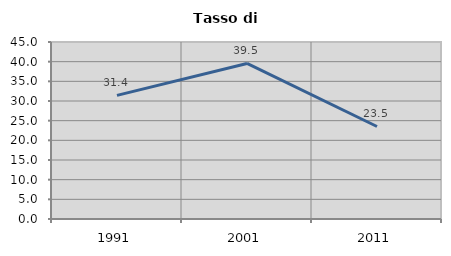
| Category | Tasso di disoccupazione   |
|---|---|
| 1991.0 | 31.421 |
| 2001.0 | 39.55 |
| 2011.0 | 23.518 |